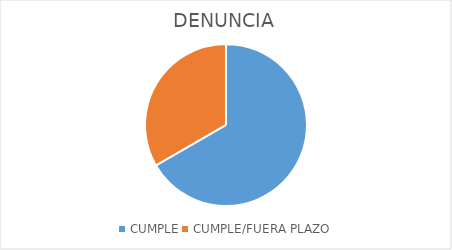
| Category | Series 0 |
|---|---|
| CUMPLE | 2 |
| CUMPLE/FUERA PLAZO | 1 |